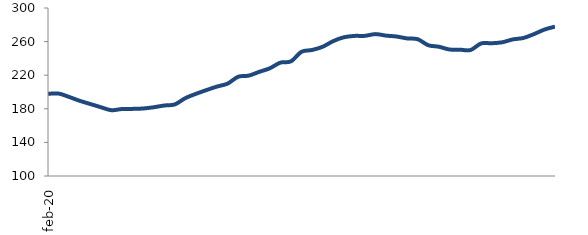
| Category | Series 0 |
|---|---|
| 2020-02-01 | 197.812 |
| 2020-03-01 | 198.146 |
| 2020-04-01 | 194.108 |
| 2020-05-01 | 189.523 |
| 2020-06-01 | 185.716 |
| 2020-07-01 | 181.903 |
| 2020-08-01 | 178.335 |
| 2020-09-01 | 179.751 |
| 2020-10-01 | 179.898 |
| 2020-11-01 | 180.344 |
| 2020-12-01 | 181.825 |
| 2021-01-01 | 183.907 |
| 2021-02-01 | 185.19 |
| 2021-03-01 | 192.66 |
| 2021-04-01 | 197.813 |
| 2021-05-01 | 202.28 |
| 2021-06-01 | 206.474 |
| 2021-07-01 | 209.951 |
| 2021-08-01 | 218.144 |
| 2021-09-01 | 219.493 |
| 2021-10-01 | 223.999 |
| 2021-11-01 | 228.232 |
| 2021-12-01 | 234.963 |
| 2022-01-01 | 236.484 |
| 2022-02-01 | 247.871 |
| 2022-03-01 | 250.003 |
| 2022-04-01 | 253.859 |
| 2022-05-01 | 260.557 |
| 2022-06-01 | 265.106 |
| 2022-07-01 | 266.765 |
| 2022-08-01 | 266.84 |
| 2022-09-01 | 268.908 |
| 2022-10-01 | 267.132 |
| 2022-11-01 | 266.057 |
| 2022-12-01 | 263.778 |
| 2023-01-01 | 262.843 |
| 2023-02-01 | 255.681 |
| 2023-03-01 | 253.909 |
| 2023-04-01 | 250.624 |
| 2023-05-01 | 250.389 |
| 2023-06-01 | 249.944 |
| 2023-07-01 | 257.761 |
| 2023-08-01 | 258.056 |
| 2023-09-01 | 259.165 |
| 2023-10-01 | 262.6 |
| 2023-11-01 | 264.293 |
| 2023-12-01 | 268.887 |
| 2024-01-01 | 274.332 |
| 2024-02-01 | 277.806 |